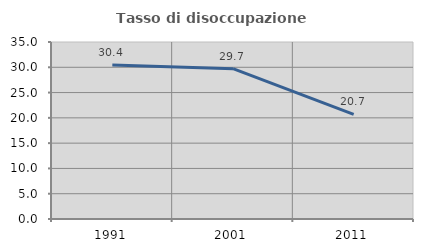
| Category | Tasso di disoccupazione giovanile  |
|---|---|
| 1991.0 | 30.435 |
| 2001.0 | 29.73 |
| 2011.0 | 20.69 |